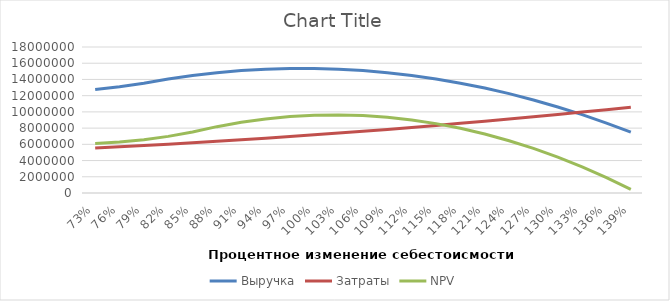
| Category | Выручка | Затраты | NPV |
|---|---|---|---|
| 0.7299999999999998 | 12765000 | 5548890 | 6114326.627 |
| 0.7599999999999998 | 13110000 | 5698860 | 6279578.698 |
| 0.7899999999999998 | 13541250 | 5856328.5 | 6568769.822 |
| 0.8199999999999998 | 14058750 | 6021295.5 | 6981900 |
| 0.8499999999999999 | 14490000 | 6193761 | 7518969.231 |
| 0.8799999999999999 | 14835000 | 6373725 | 8179977.515 |
| 0.9099999999999999 | 15093750 | 6561187.5 | 8717046.746 |
| 0.94 | 15266250 | 6756148.5 | 9130176.923 |
| 0.97 | 15352500 | 6958608 | 9419368.047 |
| 1.0 | 15352500 | 7168566 | 9584620.118 |
| 1.03 | 15266250 | 7386022.5 | 9625933.136 |
| 1.06 | 15093750 | 7610977.5 | 9543307.101 |
| 1.09 | 14835000 | 7843431 | 9336742.012 |
| 1.12 | 14490000 | 8083383 | 9006237.87 |
| 1.1500000000000001 | 14058750 | 8330833.5 | 8551794.675 |
| 1.1800000000000002 | 13541250 | 8585782.5 | 7973412.426 |
| 1.2100000000000002 | 12937500 | 8848230 | 7271091.124 |
| 1.2400000000000002 | 12247500 | 9118176 | 6444830.769 |
| 1.2700000000000002 | 11471250 | 9395620.5 | 5494631.361 |
| 1.3000000000000003 | 10608750 | 9680563.5 | 4420492.899 |
| 1.3300000000000003 | 9660000 | 9973005 | 3222415.385 |
| 1.3600000000000003 | 8625000 | 10272945 | 1900398.817 |
| 1.3900000000000003 | 7503750 | 10580383.5 | 454443.195 |